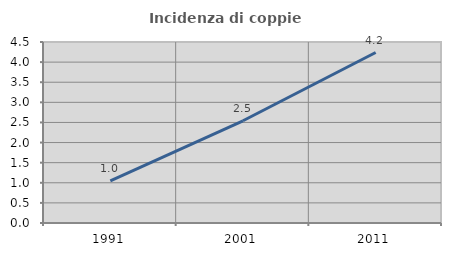
| Category | Incidenza di coppie miste |
|---|---|
| 1991.0 | 1.048 |
| 2001.0 | 2.541 |
| 2011.0 | 4.239 |